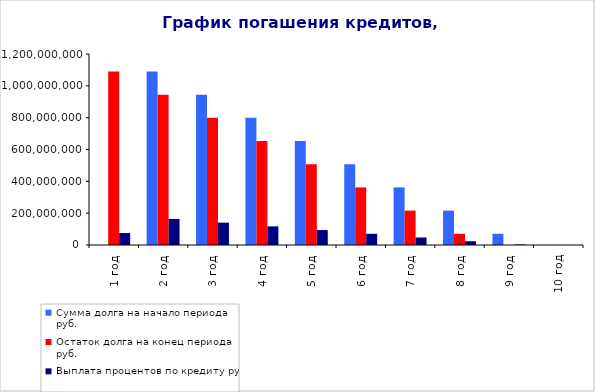
| Category | Сумма долга на начало периода | Остаток долга на конец периода | Выплата процентов по кредиту |
|---|---|---|---|
| 1 год | 0 | 1090016028.677 | 74931755.102 |
| 2 год | 1090016028.677 | 944360974.854 | 163721193.975 |
| 3 год | 944360974.854 | 798705921.03 | 140416385.363 |
| 4 год | 798705921.03 | 653050867.206 | 117111576.751 |
| 5 год | 653050867.206 | 507395813.383 | 93806768.139 |
| 6 год | 507395813.383 | 361740759.559 | 70501959.528 |
| 7 год | 361740759.559 | 216085705.735 | 47197150.916 |
| 8 год | 216085705.735 | 70430651.912 | 23892342.304 |
| 9 год | 70430651.912 | 0 | 3206867.923 |
| 10 год | 0 | 0 | 0 |